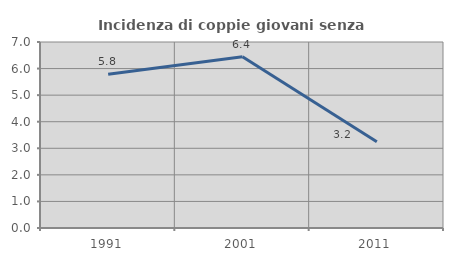
| Category | Incidenza di coppie giovani senza figli |
|---|---|
| 1991.0 | 5.788 |
| 2001.0 | 6.447 |
| 2011.0 | 3.248 |